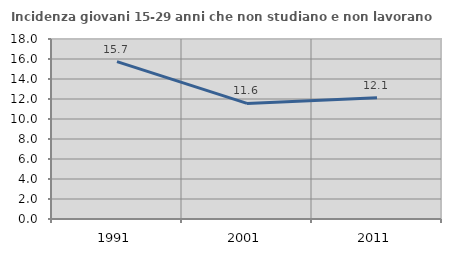
| Category | Incidenza giovani 15-29 anni che non studiano e non lavorano  |
|---|---|
| 1991.0 | 15.73 |
| 2001.0 | 11.556 |
| 2011.0 | 12.114 |